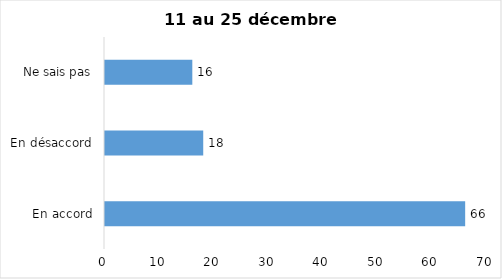
| Category | Series 0 |
|---|---|
| En accord | 66 |
| En désaccord | 18 |
| Ne sais pas | 16 |